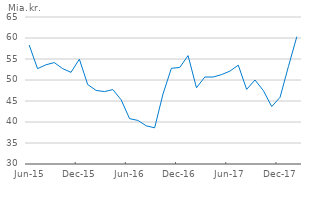
| Category | Rentefølsomhed pr. procentpoint |
|---|---|
| 2015-06-01 | 58.331 |
| 2015-07-01 | 52.7 |
| 2015-08-01 | 53.619 |
| 2015-09-01 | 54.151 |
| 2015-10-01 | 52.712 |
| 2015-11-01 | 51.822 |
| 2015-12-01 | 54.959 |
| 2016-01-01 | 48.911 |
| 2016-02-01 | 47.525 |
| 2016-03-01 | 47.237 |
| 2016-04-01 | 47.723 |
| 2016-05-01 | 45.275 |
| 2016-06-01 | 40.806 |
| 2016-07-01 | 40.371 |
| 2016-08-01 | 39.092 |
| 2016-09-01 | 38.616 |
| 2016-10-01 | 46.673 |
| 2016-11-01 | 52.784 |
| 2016-12-01 | 52.985 |
| 2017-01-01 | 55.804 |
| 2017-02-01 | 48.145 |
| 2017-03-01 | 50.714 |
| 2017-04-01 | 50.709 |
| 2017-05-01 | 51.282 |
| 2017-06-01 | 52.107 |
| 2017-07-01 | 53.532 |
| 2017-08-01 | 47.767 |
| 2017-09-01 | 50 |
| 2017-10-01 | 47.475 |
| 2017-11-01 | 43.663 |
| 2017-12-01 | 45.896 |
| 2018-01-01 | 53.248 |
| 2018-02-01 | 60.311 |